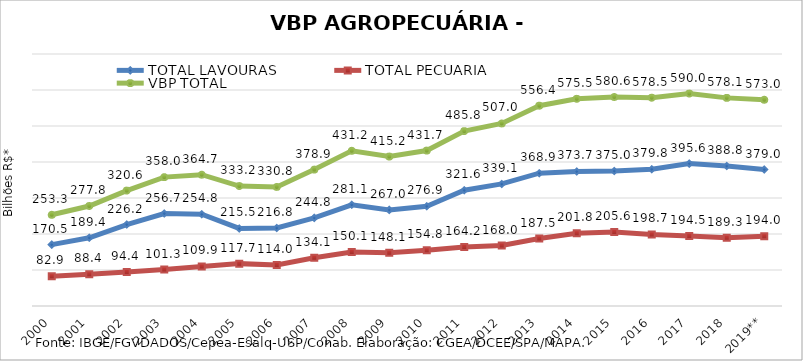
| Category | TOTAL LAVOURAS | TOTAL PECUÁRIA | VBP TOTAL |
|---|---|---|---|
| 2000 | 170.466 | 82.862 | 253.328 |
| 2001 | 189.356 | 88.403 | 277.76 |
| 2002 | 226.193 | 94.371 | 320.564 |
| 2003 | 256.727 | 101.291 | 358.018 |
| 2004 | 254.847 | 109.871 | 364.719 |
| 2005 | 215.462 | 117.699 | 333.161 |
| 2006 | 216.778 | 113.993 | 330.771 |
| 2007 | 244.812 | 134.106 | 378.918 |
| 2008 | 281.104 | 150.097 | 431.201 |
| 2009 | 267.012 | 148.145 | 415.156 |
| 2010 | 276.921 | 154.783 | 431.703 |
| 2011 | 321.609 | 164.185 | 485.794 |
| 2012 | 339.098 | 167.951 | 507.049 |
| 2013 | 368.941 | 187.497 | 556.438 |
| 2014 | 373.687 | 201.8 | 575.488 |
| 2015 | 375.043 | 205.579 | 580.623 |
| 2016 | 379.786 | 198.744 | 578.53 |
| 2017 | 395.565 | 194.473 | 590.039 |
| 2018 | 388.772 | 189.342 | 578.114 |
| 2019** | 378.988 | 193.975 | 572.963 |